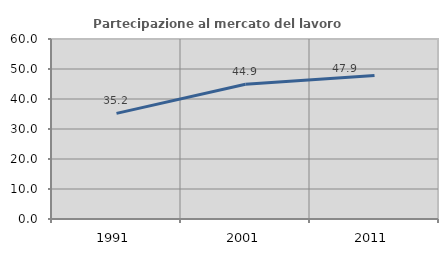
| Category | Partecipazione al mercato del lavoro  femminile |
|---|---|
| 1991.0 | 35.211 |
| 2001.0 | 44.94 |
| 2011.0 | 47.859 |